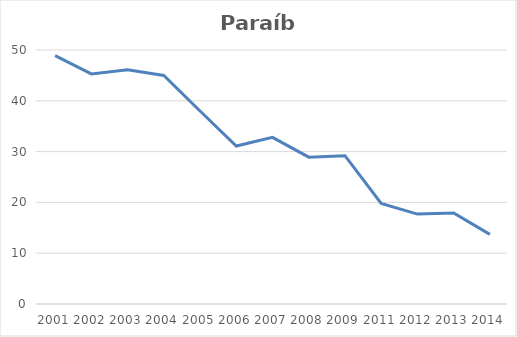
| Category | Total |
|---|---|
| 2001.0 | 48.9 |
| 2002.0 | 45.3 |
| 2003.0 | 46.1 |
| 2004.0 | 45 |
| 2005.0 | 38 |
| 2006.0 | 31.1 |
| 2007.0 | 32.8 |
| 2008.0 | 28.9 |
| 2009.0 | 29.2 |
| 2011.0 | 19.8 |
| 2012.0 | 17.7 |
| 2013.0 | 17.9 |
| 2014.0 | 13.7 |